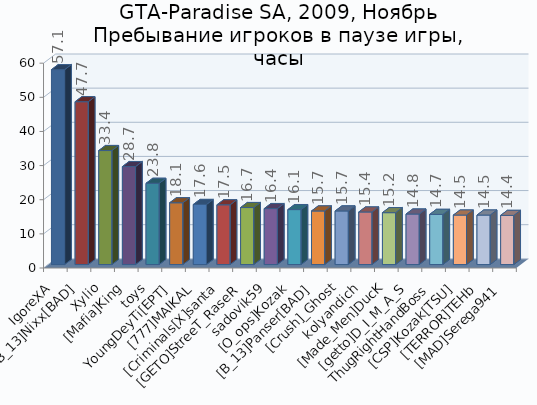
| Category | Series 0 |
|---|---|
| IgoreXA | 57.1 |
| [B_13]Nixx[BAD] | 47.7 |
| Xylio | 33.4 |
| [Mafia]King | 28.7 |
| toys | 23.8 |
| YoungDeyTi[EPT] | 18.1 |
| [777]MAIKAL | 17.6 |
| [Criminals[X]santa | 17.5 |
| [GETO]StreeT_RaseR | 16.7 |
| sadovik59 | 16.4 |
| [O_ops]Kozak | 16.1 |
| [B_13]Panser[BAD] | 15.7 |
| [Crush]_Ghost | 15.7 |
| kolyandich | 15.4 |
| [Made_Men]DucK | 15.2 |
| [getto]D_I_M_A_S | 14.8 |
| ThugRightHandBoss | 14.7 |
| [CSP]Kozak[TSU] | 14.5 |
| [TERROR]TEHb | 14.5 |
| [MAD]Serega941 | 14.4 |